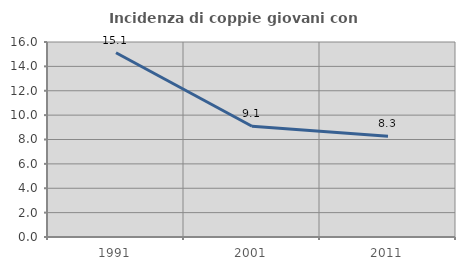
| Category | Incidenza di coppie giovani con figli |
|---|---|
| 1991.0 | 15.122 |
| 2001.0 | 9.091 |
| 2011.0 | 8.264 |